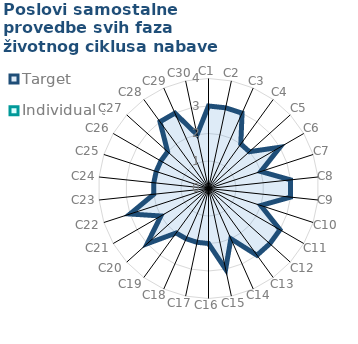
| Category | Target | Individual 3 |
|---|---|---|
| C1 | 3 | 0 |
| C2 | 3 | 0 |
| C3 | 3 | 0 |
| C4 | 2 | 0 |
| C5 | 2 | 0 |
| C6 | 3 | 0 |
| C7 | 2 | 0 |
| C8 | 3 | 0 |
| C9 | 3 | 0 |
| C10 | 2 | 0 |
| C11 | 3 | 0 |
| C12 | 3 | 0 |
| C13 | 3 | 0 |
| C14 | 2 | 0 |
| C15 | 3 | 0 |
| C16 | 2 | 0 |
| C17 | 2 | 0 |
| C18 | 2 | 0 |
| C19 | 2 | 0 |
| C20 | 3 | 0 |
| C21 | 2 | 0 |
| C22 | 3 | 0 |
| C23 | 2 | 0 |
| C24 | 2 | 0 |
| C25 | 2 | 0 |
| C26 | 2 | 0 |
| C27 | 2 | 0 |
| C28 | 3 | 0 |
| C29 | 3 | 0 |
| C30 | 2 | 0 |